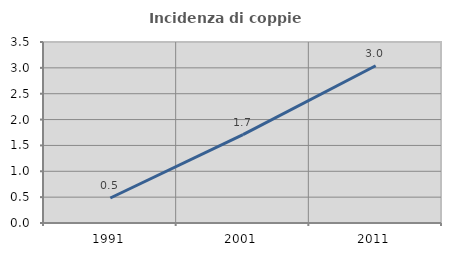
| Category | Incidenza di coppie miste |
|---|---|
| 1991.0 | 0.484 |
| 2001.0 | 1.71 |
| 2011.0 | 3.041 |